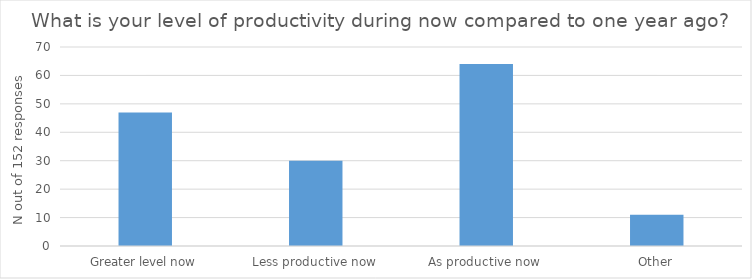
| Category | N out of 152 responses |
|---|---|
| Greater level now | 47 |
| Less productive now | 30 |
| As productive now | 64 |
| Other | 11 |